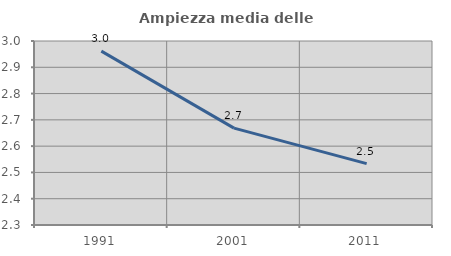
| Category | Ampiezza media delle famiglie |
|---|---|
| 1991.0 | 2.961 |
| 2001.0 | 2.669 |
| 2011.0 | 2.533 |